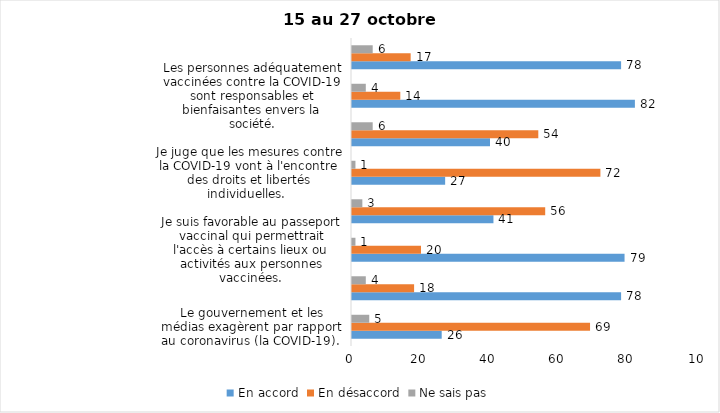
| Category | En accord | En désaccord | Ne sais pas |
|---|---|---|---|
| Le gouvernement et les médias exagèrent par rapport au coronavirus (la COVID-19). | 26 | 69 | 5 |
| J’ai peur que le système de santé soit débordé par les cas de COVID-19. | 78 | 18 | 4 |
| Je suis favorable au passeport vaccinal qui permettrait l'accès à certains lieux ou activités aux personnes vaccinées. | 79 | 20 | 1 |
| Je suis favorable à ce que le port du masque ne soit plus obligatoire au Québec. | 41 | 56 | 3 |
| Je juge que les mesures contre la COVID-19 vont à l'encontre des droits et libertés individuelles.  | 27 | 72 | 1 |
| Je pense que le gouvernement du Québec devrait mettre fin à l’état d’urgence sanitaire.  | 40 | 54 | 6 |
| Les personnes adéquatement vaccinées contre la COVID-19 sont responsables et bienfaisantes envers la société. | 82 | 14 | 4 |
| Les personnes non adéquatement vaccinées contre la COVID-19 sont responsables des novueaux cas et hospitalisations et contribuent à la prolongation de la pandémie au Québec. | 78 | 17 | 6 |